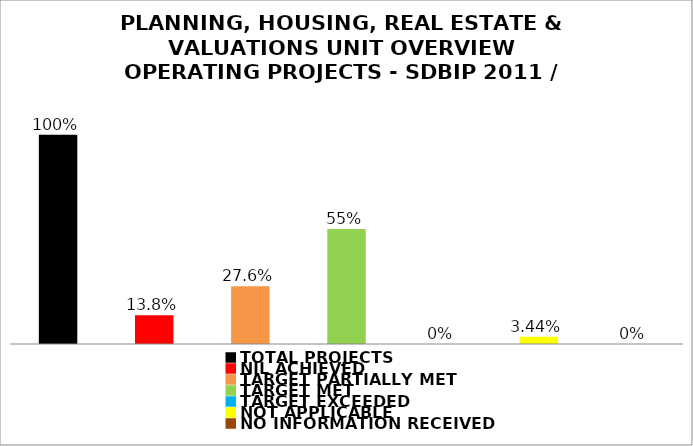
| Category | Series 0 |
|---|---|
| TOTAL PROJECTS | 1 |
| NIL ACHIEVED | 0.138 |
| TARGET PARTIALLY MET | 0.276 |
| TARGET MET | 0.55 |
| TARGET EXCEEDED | 0 |
| NOT APPLICABLE | 0.034 |
| NO INFORMATION RECEIVED | 0 |